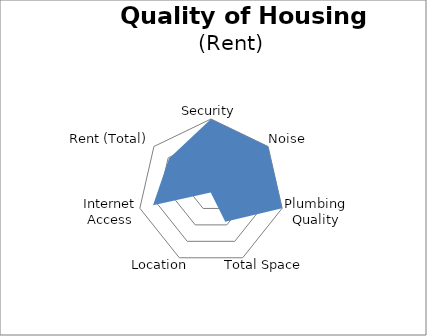
| Category | Rental Ranking |
|---|---|
| Security | 100 |
| Noise | 100 |
| Plumbing Quality | 100 |
| Total Space | 45.119 |
| Location | 0.928 |
| Internet Access | 81.441 |
| Rent (Total) | 73.529 |